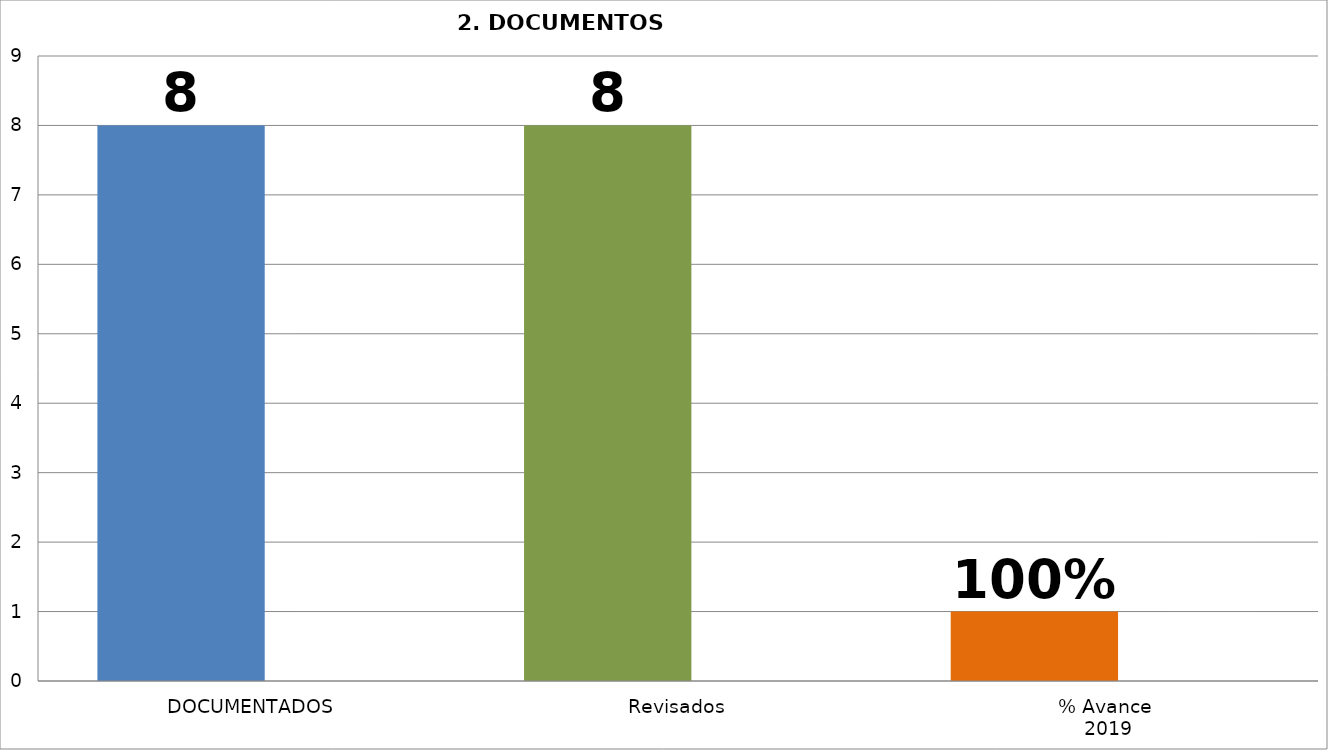
| Category | Series 2 | Series 4 | Series 0 | Series 1 | Series 5 | Series 14 | Series 15 | Series 16 |
|---|---|---|---|---|---|---|---|---|
| DOCUMENTADOS | 8 |  |  |  |  |  |  |  |
| Revisados | 8 |  |  |  |  |  |  |  |
| % Avance
 2019 | 1 |  |  |  |  |  |  |  |